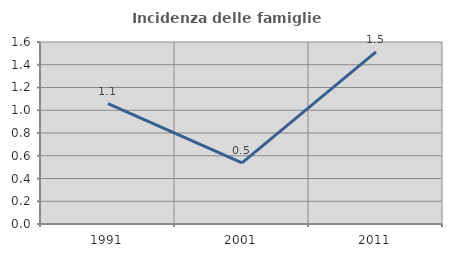
| Category | Incidenza delle famiglie numerose |
|---|---|
| 1991.0 | 1.059 |
| 2001.0 | 0.537 |
| 2011.0 | 1.513 |